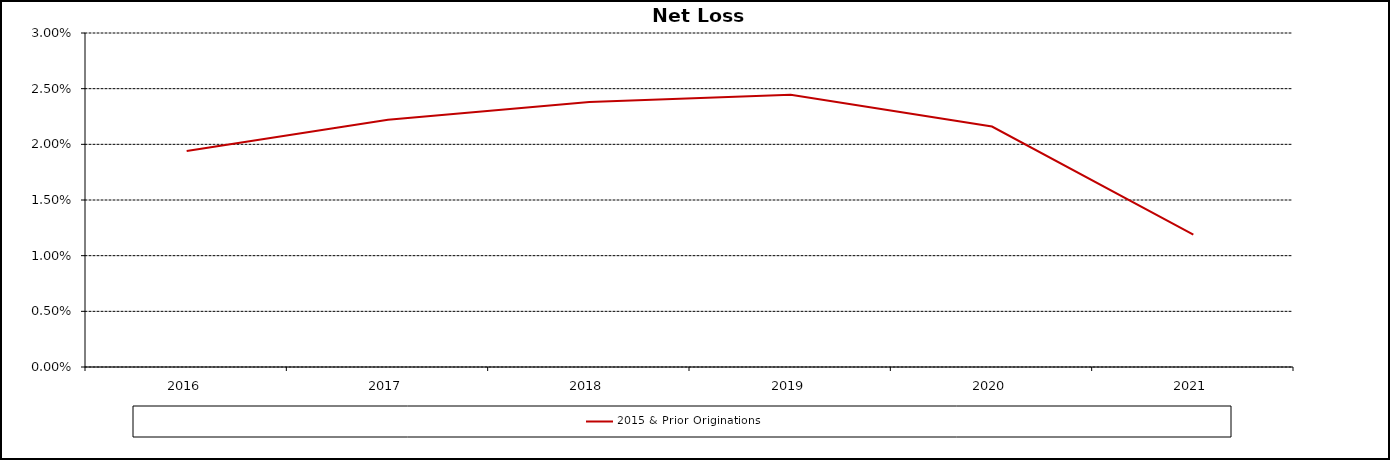
| Category | 2015 & Prior Originations |
|---|---|
| 2016.0 | 0.019 |
| 2017.0 | 0.022 |
| 2018.0 | 0.024 |
| 2019.0 | 0.024 |
| 2020.0 | 0.022 |
| 2021.0 | 0.012 |